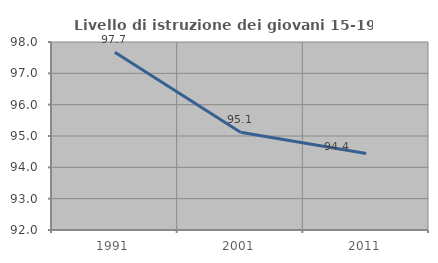
| Category | Livello di istruzione dei giovani 15-19 anni |
|---|---|
| 1991.0 | 97.674 |
| 2001.0 | 95.122 |
| 2011.0 | 94.444 |